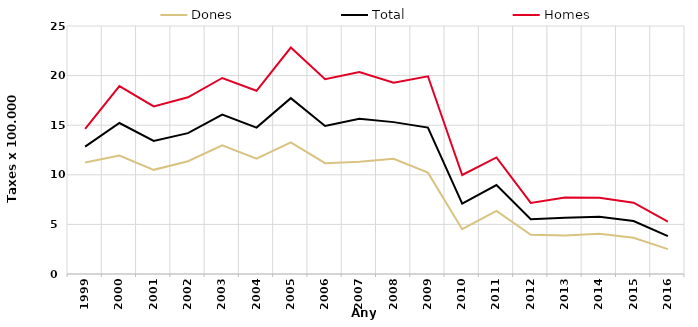
| Category | Dones | Total | Homes |
|---|---|---|---|
| 1999.0 | 11.24 | 12.84 | 14.64 |
| 2000.0 | 11.94 | 15.22 | 18.95 |
| 2001.0 | 10.5 | 13.42 | 16.9 |
| 2002.0 | 11.37 | 14.2 | 17.81 |
| 2003.0 | 12.98 | 16.06 | 19.76 |
| 2004.0 | 11.62 | 14.76 | 18.47 |
| 2005.0 | 13.26 | 17.73 | 22.83 |
| 2006.0 | 11.17 | 14.92 | 19.64 |
| 2007.0 | 11.31 | 15.64 | 20.35 |
| 2008.0 | 11.61 | 15.31 | 19.29 |
| 2009.0 | 10.22 | 14.76 | 19.93 |
| 2010.0 | 4.52 | 7.1 | 9.98 |
| 2011.0 | 6.36 | 8.97 | 11.75 |
| 2012.0 | 3.96 | 5.53 | 7.17 |
| 2013.0 | 3.89 | 5.66 | 7.7 |
| 2014.0 | 4.06 | 5.77 | 7.68 |
| 2015.0 | 3.66 | 5.34 | 7.19 |
| 2016.0 | 2.51 | 3.81 | 5.27 |